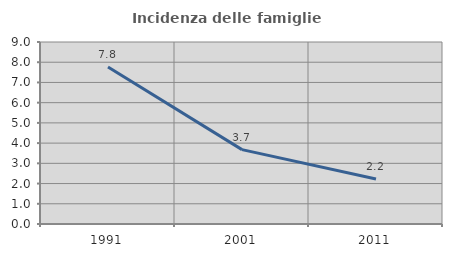
| Category | Incidenza delle famiglie numerose |
|---|---|
| 1991.0 | 7.764 |
| 2001.0 | 3.679 |
| 2011.0 | 2.223 |